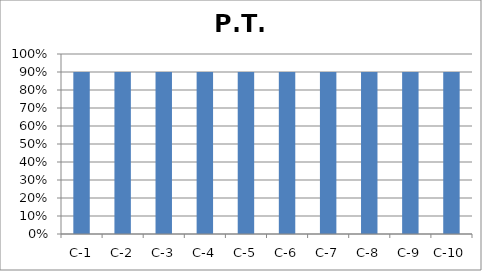
| Category | P.T. |
|---|---|
| C-1 | 0.9 |
| C-2 | 0.9 |
| C-3 | 0.9 |
| C-4 | 0.9 |
| C-5 | 0.9 |
| C-6 | 0.9 |
| C-7 | 0.9 |
| C-8 | 0.9 |
| C-9 | 0.9 |
| C-10 | 0.9 |